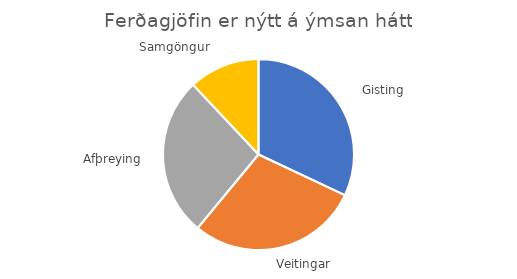
| Category | Series 0 |
|---|---|
| Gisting  | 0.32 |
| Veitingar | 0.29 |
| Afþreying | 0.27 |
| Samgöngur  | 0.12 |